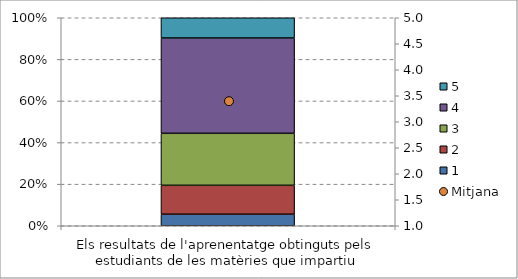
| Category | 1 | 2 | 3 | 4 | 5 |
|---|---|---|---|---|---|
| Els resultats de l'aprenentatge obtinguts pels estudiants de les matèries que impartiu | 4 | 10 | 18 | 33 | 7 |